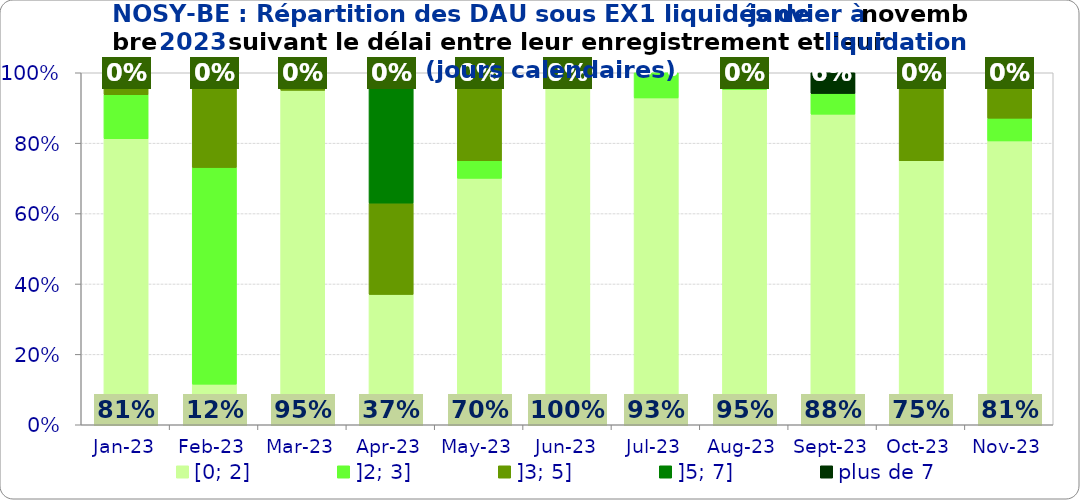
| Category | [0; 2] | ]2; 3] | ]3; 5] | ]5; 7] | plus de 7 |
|---|---|---|---|---|---|
| 2023-01-01 | 0.812 | 0.125 | 0.062 | 0 | 0 |
| 2023-02-01 | 0.115 | 0.615 | 0.269 | 0 | 0 |
| 2023-03-01 | 0.95 | 0 | 0.05 | 0 | 0 |
| 2023-04-01 | 0.37 | 0 | 0.259 | 0.37 | 0 |
| 2023-05-01 | 0.7 | 0.05 | 0.25 | 0 | 0 |
| 2023-06-01 | 1 | 0 | 0 | 0 | 0 |
| 2023-07-01 | 0.929 | 0.071 | 0 | 0 | 0 |
| 2023-08-01 | 0.952 | 0.048 | 0 | 0 | 0 |
| 2023-09-01 | 0.882 | 0.059 | 0 | 0 | 0.059 |
| 2023-10-01 | 0.75 | 0 | 0.25 | 0 | 0 |
| 2023-11-01 | 0.806 | 0.065 | 0.129 | 0 | 0 |